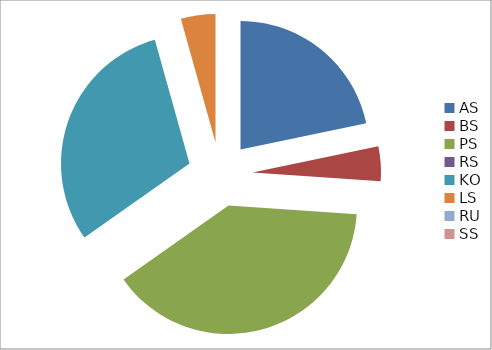
| Category | Series 0 |
|---|---|
| AS | 5 |
| BS | 1 |
| PS | 9 |
| RS | 0 |
| KO | 7 |
| LS | 1 |
| RU | 0 |
| SS | 0 |